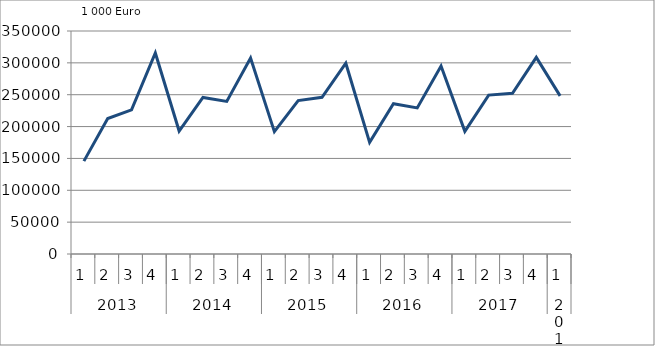
| Category | Ausbaugewerblicher Umsatz3 |
|---|---|
| 0 | 145792.596 |
| 1 | 212577 |
| 2 | 226327.748 |
| 3 | 315433.896 |
| 4 | 193004.858 |
| 5 | 245754.159 |
| 6 | 239547.85 |
| 7 | 307688.935 |
| 8 | 192043.756 |
| 9 | 240826.879 |
| 10 | 245916.087 |
| 11 | 299455.378 |
| 12 | 175225.59 |
| 13 | 235781.631 |
| 14 | 229227.559 |
| 15 | 294992.157 |
| 16 | 192499.539 |
| 17 | 249394.388 |
| 18 | 252146.755 |
| 19 | 308653.153 |
| 20 | 248133.418 |